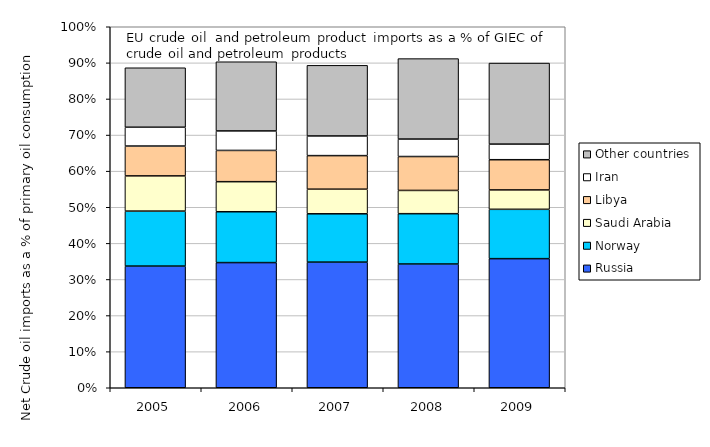
| Category | Russia | Norway | Saudi Arabia | Libya | Iran | Other countries |
|---|---|---|---|---|---|---|
| 2005.0 | 0.337 | 0.152 | 0.097 | 0.083 | 0.052 | 0.165 |
| 2006.0 | 0.347 | 0.141 | 0.083 | 0.087 | 0.054 | 0.192 |
| 2007.0 | 0.348 | 0.134 | 0.068 | 0.093 | 0.054 | 0.196 |
| 2008.0 | 0.343 | 0.139 | 0.064 | 0.094 | 0.048 | 0.223 |
| 2009.0 | 0.358 | 0.137 | 0.054 | 0.084 | 0.043 | 0.225 |